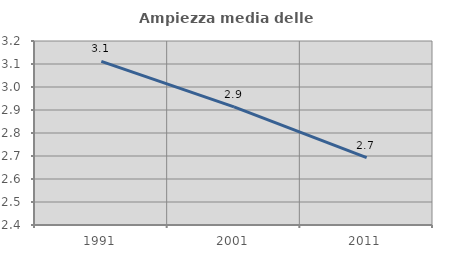
| Category | Ampiezza media delle famiglie |
|---|---|
| 1991.0 | 3.111 |
| 2001.0 | 2.914 |
| 2011.0 | 2.693 |